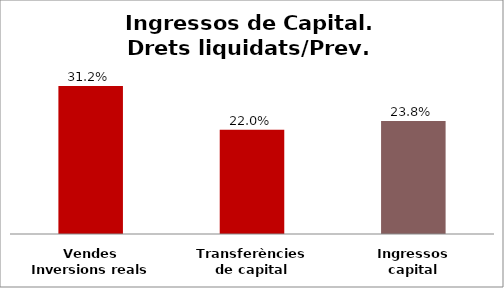
| Category | Series 0 |
|---|---|
| Vendes Inversions reals | 0.312 |
| Transferències de capital | 0.22 |
| Ingressos capital | 0.238 |